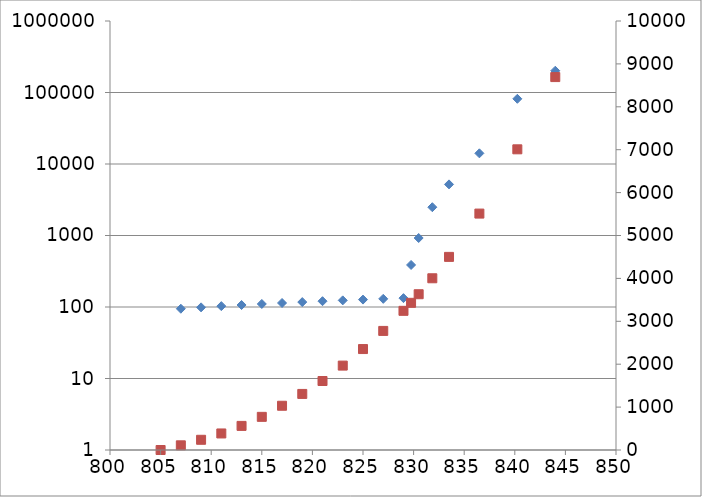
| Category | Total Discharge |
|---|---|
| 805.0 | 0 |
| 807.0 | 94.57 |
| 809.0 | 98.89 |
| 811.0 | 102.83 |
| 813.0 | 106.61 |
| 815.0 | 110.29 |
| 817.0 | 113.8 |
| 819.0 | 117.22 |
| 821.0 | 120.57 |
| 823.0 | 123.81 |
| 825.0 | 126.97 |
| 827.0 | 130.05 |
| 829.0 | 133.07 |
| 829.75 | 387.16 |
| 830.5 | 922.26 |
| 831.85 | 2486.81 |
| 833.5 | 5186.03 |
| 836.5 | 14100.09 |
| 840.25 | 81641.54 |
| 844.0 | 201496.45 |